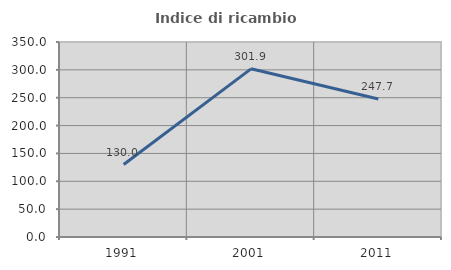
| Category | Indice di ricambio occupazionale  |
|---|---|
| 1991.0 | 130 |
| 2001.0 | 301.852 |
| 2011.0 | 247.692 |